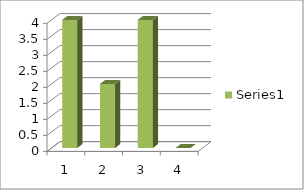
| Category | Series 0 |
|---|---|
| 0 | 4 |
| 1 | 2 |
| 2 | 4 |
| 3 | 0 |